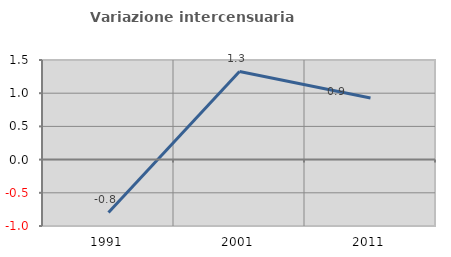
| Category | Variazione intercensuaria annua |
|---|---|
| 1991.0 | -0.796 |
| 2001.0 | 1.327 |
| 2011.0 | 0.928 |